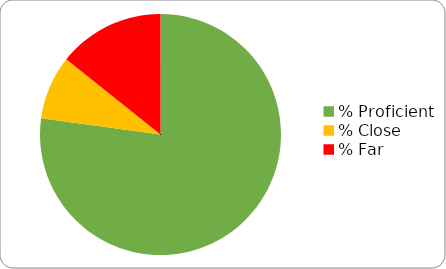
| Category | Series 0 |
|---|---|
| % Proficient | 0.771 |
| % Close | 0.086 |
| % Far | 0.143 |